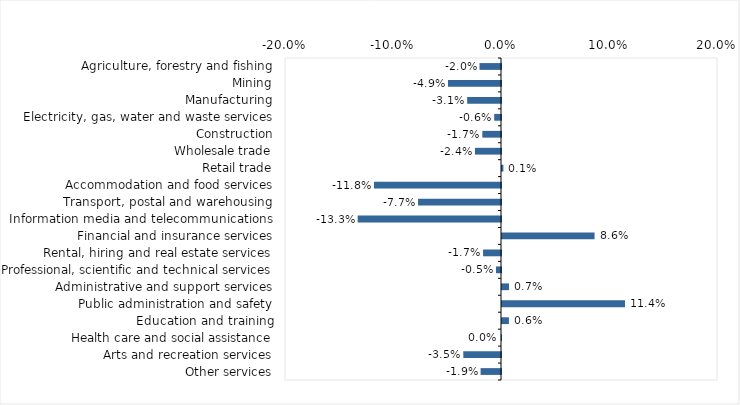
| Category | This week |
|---|---|
| Agriculture, forestry and fishing | -0.02 |
| Mining | -0.049 |
| Manufacturing | -0.031 |
| Electricity, gas, water and waste services | -0.006 |
| Construction | -0.017 |
| Wholesale trade | -0.024 |
| Retail trade | 0.001 |
| Accommodation and food services | -0.118 |
| Transport, postal and warehousing | -0.077 |
| Information media and telecommunications | -0.133 |
| Financial and insurance services | 0.086 |
| Rental, hiring and real estate services | -0.017 |
| Professional, scientific and technical services | -0.005 |
| Administrative and support services | 0.006 |
| Public administration and safety | 0.114 |
| Education and training | 0.006 |
| Health care and social assistance | 0 |
| Arts and recreation services | -0.035 |
| Other services | -0.019 |